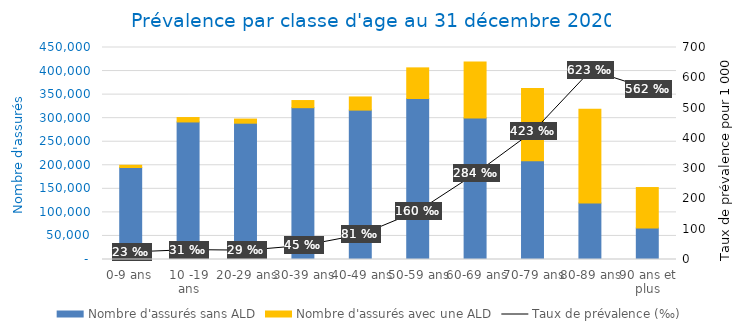
| Category | Nombre d'assurés sans ALD | Nombre d'assurés avec une ALD |
|---|---|---|
| 0-9 ans | 195321 | 4676 |
| 10 -19 ans | 291962 | 9365 |
| 20-29 ans | 289341 | 8699 |
| 30-39 ans | 322234 | 15186 |
| 40-49 ans | 317091 | 27964 |
| 50-59 ans | 341769 | 65004 |
| 60-69 ans | 300199 | 118796 |
| 70-79 ans | 209505 | 153456 |
| 80-89 ans | 120084 | 198843 |
| 90 ans et plus | 66836 | 85925 |